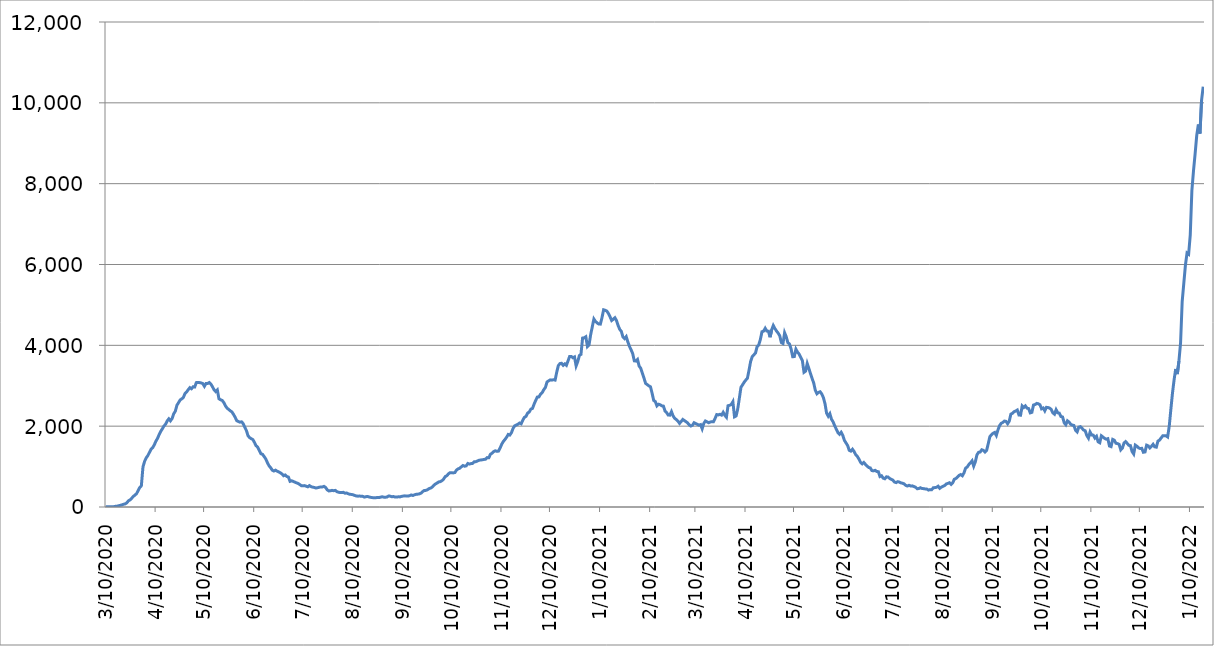
| Category | Series 0 |
|---|---|
| 2020-03-10 | 5 |
| 2020-03-11 | 5 |
| 2020-03-12 | 5 |
| 2020-03-13 | 7 |
| 2020-03-14 | 9 |
| 2020-03-15 | 9 |
| 2020-03-16 | 17 |
| 2020-03-17 | 22 |
| 2020-03-18 | 31 |
| 2020-03-19 | 42 |
| 2020-03-20 | 52 |
| 2020-03-21 | 68 |
| 2020-03-22 | 76 |
| 2020-03-23 | 103 |
| 2020-03-24 | 153 |
| 2020-03-25 | 176 |
| 2020-03-26 | 216 |
| 2020-03-27 | 260 |
| 2020-03-28 | 294 |
| 2020-03-29 | 329 |
| 2020-03-30 | 406 |
| 2020-03-31 | 482 |
| 2020-04-01 | 526 |
| 2020-04-02 | 993 |
| 2020-04-03 | 1129 |
| 2020-04-04 | 1216 |
| 2020-04-05 | 1272 |
| 2020-04-06 | 1351 |
| 2020-04-07 | 1430 |
| 2020-04-08 | 1467 |
| 2020-04-09 | 1538 |
| 2020-04-10 | 1629 |
| 2020-04-11 | 1696 |
| 2020-04-12 | 1792 |
| 2020-04-13 | 1872 |
| 2020-04-14 | 1936 |
| 2020-04-15 | 2006 |
| 2020-04-16 | 2048 |
| 2020-04-17 | 2131 |
| 2020-04-18 | 2182 |
| 2020-04-19 | 2132 |
| 2020-04-20 | 2188 |
| 2020-04-21 | 2305 |
| 2020-04-22 | 2369 |
| 2020-04-23 | 2517 |
| 2020-04-24 | 2582 |
| 2020-04-25 | 2649 |
| 2020-04-26 | 2676 |
| 2020-04-27 | 2713 |
| 2020-04-28 | 2807 |
| 2020-04-29 | 2847 |
| 2020-04-30 | 2903 |
| 2020-05-01 | 2953 |
| 2020-05-02 | 2926 |
| 2020-05-03 | 2974 |
| 2020-05-04 | 2969 |
| 2020-05-05 | 3078 |
| 2020-05-06 | 3083 |
| 2020-05-07 | 3078 |
| 2020-05-08 | 3070 |
| 2020-05-09 | 3054 |
| 2020-05-10 | 2987 |
| 2020-05-11 | 3057 |
| 2020-05-12 | 3056 |
| 2020-05-13 | 3079 |
| 2020-05-14 | 3041 |
| 2020-05-15 | 2975 |
| 2020-05-16 | 2899 |
| 2020-05-17 | 2856 |
| 2020-05-18 | 2896 |
| 2020-05-19 | 2678 |
| 2020-05-20 | 2654 |
| 2020-05-21 | 2637 |
| 2020-05-22 | 2585 |
| 2020-05-23 | 2504 |
| 2020-05-24 | 2448 |
| 2020-05-25 | 2415 |
| 2020-05-26 | 2381 |
| 2020-05-27 | 2354 |
| 2020-05-28 | 2292 |
| 2020-05-29 | 2223 |
| 2020-05-30 | 2137 |
| 2020-05-31 | 2116 |
| 2020-06-01 | 2099 |
| 2020-06-02 | 2107 |
| 2020-06-03 | 2063 |
| 2020-06-04 | 1972 |
| 2020-06-05 | 1891 |
| 2020-06-06 | 1763 |
| 2020-06-07 | 1716 |
| 2020-06-08 | 1689 |
| 2020-06-09 | 1668 |
| 2020-06-10 | 1596 |
| 2020-06-11 | 1515 |
| 2020-06-12 | 1479 |
| 2020-06-13 | 1395 |
| 2020-06-14 | 1317 |
| 2020-06-15 | 1304 |
| 2020-06-16 | 1246 |
| 2020-06-17 | 1186 |
| 2020-06-18 | 1097 |
| 2020-06-19 | 1019 |
| 2020-06-20 | 972 |
| 2020-06-21 | 912 |
| 2020-06-22 | 891 |
| 2020-06-23 | 912 |
| 2020-06-24 | 886 |
| 2020-06-25 | 869 |
| 2020-06-26 | 846 |
| 2020-06-27 | 818 |
| 2020-06-28 | 774 |
| 2020-06-29 | 792 |
| 2020-06-30 | 756 |
| 2020-07-01 | 740 |
| 2020-07-02 | 635 |
| 2020-07-03 | 649 |
| 2020-07-04 | 632 |
| 2020-07-05 | 615 |
| 2020-07-06 | 597 |
| 2020-07-07 | 582 |
| 2020-07-08 | 556 |
| 2020-07-09 | 526 |
| 2020-07-10 | 527 |
| 2020-07-11 | 529 |
| 2020-07-12 | 514 |
| 2020-07-13 | 499 |
| 2020-07-14 | 530 |
| 2020-07-15 | 503 |
| 2020-07-16 | 491 |
| 2020-07-17 | 483 |
| 2020-07-18 | 470 |
| 2020-07-19 | 477 |
| 2020-07-20 | 488 |
| 2020-07-21 | 496 |
| 2020-07-22 | 496 |
| 2020-07-23 | 511 |
| 2020-07-24 | 484 |
| 2020-07-25 | 425 |
| 2020-07-26 | 398 |
| 2020-07-27 | 401 |
| 2020-07-28 | 412 |
| 2020-07-29 | 403 |
| 2020-07-30 | 411 |
| 2020-07-31 | 379 |
| 2020-08-01 | 366 |
| 2020-08-02 | 358 |
| 2020-08-03 | 359 |
| 2020-08-04 | 363 |
| 2020-08-05 | 341 |
| 2020-08-06 | 346 |
| 2020-08-07 | 328 |
| 2020-08-08 | 314 |
| 2020-08-09 | 311 |
| 2020-08-10 | 302 |
| 2020-08-11 | 286 |
| 2020-08-12 | 273 |
| 2020-08-13 | 268 |
| 2020-08-14 | 271 |
| 2020-08-15 | 265 |
| 2020-08-16 | 263 |
| 2020-08-17 | 245 |
| 2020-08-18 | 256 |
| 2020-08-19 | 259 |
| 2020-08-20 | 247 |
| 2020-08-21 | 238 |
| 2020-08-22 | 232 |
| 2020-08-23 | 226 |
| 2020-08-24 | 229 |
| 2020-08-25 | 236 |
| 2020-08-26 | 233 |
| 2020-08-27 | 243 |
| 2020-08-28 | 253 |
| 2020-08-29 | 243 |
| 2020-08-30 | 242 |
| 2020-08-31 | 247 |
| 2020-09-01 | 273 |
| 2020-09-02 | 268 |
| 2020-09-03 | 254 |
| 2020-09-04 | 260 |
| 2020-09-05 | 245 |
| 2020-09-06 | 246 |
| 2020-09-07 | 252 |
| 2020-09-08 | 250 |
| 2020-09-09 | 263 |
| 2020-09-10 | 270 |
| 2020-09-11 | 276 |
| 2020-09-12 | 273 |
| 2020-09-13 | 270 |
| 2020-09-14 | 281 |
| 2020-09-15 | 298 |
| 2020-09-16 | 285 |
| 2020-09-17 | 302 |
| 2020-09-18 | 313 |
| 2020-09-19 | 318 |
| 2020-09-20 | 325 |
| 2020-09-21 | 342 |
| 2020-09-22 | 380 |
| 2020-09-23 | 408 |
| 2020-09-24 | 411 |
| 2020-09-25 | 426 |
| 2020-09-26 | 456 |
| 2020-09-27 | 467 |
| 2020-09-28 | 494 |
| 2020-09-29 | 539 |
| 2020-09-30 | 571 |
| 2020-10-01 | 593 |
| 2020-10-02 | 621 |
| 2020-10-03 | 628 |
| 2020-10-04 | 652 |
| 2020-10-05 | 690 |
| 2020-10-06 | 752 |
| 2020-10-07 | 774 |
| 2020-10-08 | 820 |
| 2020-10-09 | 849 |
| 2020-10-10 | 845 |
| 2020-10-11 | 844 |
| 2020-10-12 | 853 |
| 2020-10-13 | 915 |
| 2020-10-14 | 943 |
| 2020-10-15 | 960 |
| 2020-10-16 | 995 |
| 2020-10-17 | 1026 |
| 2020-10-18 | 1009 |
| 2020-10-19 | 1018 |
| 2020-10-20 | 1077 |
| 2020-10-21 | 1062 |
| 2020-10-22 | 1074 |
| 2020-10-23 | 1079 |
| 2020-10-24 | 1122 |
| 2020-10-25 | 1122 |
| 2020-10-26 | 1140 |
| 2020-10-27 | 1157 |
| 2020-10-28 | 1163 |
| 2020-10-29 | 1168 |
| 2020-10-30 | 1177 |
| 2020-10-31 | 1182 |
| 2020-11-01 | 1222 |
| 2020-11-02 | 1220 |
| 2020-11-03 | 1305 |
| 2020-11-04 | 1333 |
| 2020-11-05 | 1370 |
| 2020-11-06 | 1391 |
| 2020-11-07 | 1377 |
| 2020-11-08 | 1383 |
| 2020-11-09 | 1463 |
| 2020-11-10 | 1556 |
| 2020-11-11 | 1623 |
| 2020-11-12 | 1671 |
| 2020-11-13 | 1727 |
| 2020-11-14 | 1795 |
| 2020-11-15 | 1780 |
| 2020-11-16 | 1840 |
| 2020-11-17 | 1945 |
| 2020-11-18 | 2009 |
| 2020-11-19 | 2027 |
| 2020-11-20 | 2048 |
| 2020-11-21 | 2077 |
| 2020-11-22 | 2059 |
| 2020-11-23 | 2148 |
| 2020-11-24 | 2218 |
| 2020-11-25 | 2243 |
| 2020-11-26 | 2324 |
| 2020-11-27 | 2350 |
| 2020-11-28 | 2422 |
| 2020-11-29 | 2438 |
| 2020-11-30 | 2545 |
| 2020-12-01 | 2638 |
| 2020-12-02 | 2720 |
| 2020-12-03 | 2724 |
| 2020-12-04 | 2793 |
| 2020-12-05 | 2830 |
| 2020-12-06 | 2903 |
| 2020-12-07 | 2957 |
| 2020-12-08 | 3093 |
| 2020-12-09 | 3121 |
| 2020-12-10 | 3145 |
| 2020-12-11 | 3139 |
| 2020-12-12 | 3149 |
| 2020-12-13 | 3140 |
| 2020-12-14 | 3335 |
| 2020-12-15 | 3499 |
| 2020-12-16 | 3549 |
| 2020-12-17 | 3556 |
| 2020-12-18 | 3506 |
| 2020-12-19 | 3542 |
| 2020-12-20 | 3506 |
| 2020-12-21 | 3616 |
| 2020-12-22 | 3726 |
| 2020-12-23 | 3725 |
| 2020-12-24 | 3694 |
| 2020-12-25 | 3714 |
| 2020-12-26 | 3491 |
| 2020-12-27 | 3596 |
| 2020-12-28 | 3747 |
| 2020-12-29 | 3776 |
| 2020-12-30 | 4180 |
| 2020-12-31 | 4187 |
| 2021-01-01 | 4212 |
| 2021-01-02 | 3970 |
| 2021-01-03 | 4012 |
| 2021-01-04 | 4263 |
| 2021-01-05 | 4457 |
| 2021-01-06 | 4651 |
| 2021-01-07 | 4592 |
| 2021-01-08 | 4554 |
| 2021-01-09 | 4527 |
| 2021-01-10 | 4525 |
| 2021-01-11 | 4683 |
| 2021-01-12 | 4879 |
| 2021-01-13 | 4868 |
| 2021-01-14 | 4848 |
| 2021-01-15 | 4787 |
| 2021-01-16 | 4706 |
| 2021-01-17 | 4614 |
| 2021-01-18 | 4645 |
| 2021-01-19 | 4683 |
| 2021-01-20 | 4612 |
| 2021-01-21 | 4490 |
| 2021-01-22 | 4395 |
| 2021-01-23 | 4344 |
| 2021-01-24 | 4204 |
| 2021-01-25 | 4165 |
| 2021-01-26 | 4215 |
| 2021-01-27 | 4087 |
| 2021-01-28 | 3975 |
| 2021-01-29 | 3890 |
| 2021-01-30 | 3797 |
| 2021-01-31 | 3617 |
| 2021-02-01 | 3610 |
| 2021-02-02 | 3649 |
| 2021-02-03 | 3486 |
| 2021-02-04 | 3432 |
| 2021-02-05 | 3312 |
| 2021-02-06 | 3188 |
| 2021-02-07 | 3058 |
| 2021-02-08 | 3029 |
| 2021-02-09 | 2997 |
| 2021-02-10 | 2975 |
| 2021-02-11 | 2816 |
| 2021-02-12 | 2638 |
| 2021-02-13 | 2608 |
| 2021-02-14 | 2503 |
| 2021-02-15 | 2542 |
| 2021-02-16 | 2531 |
| 2021-02-17 | 2504 |
| 2021-02-18 | 2497 |
| 2021-02-19 | 2375 |
| 2021-02-20 | 2335 |
| 2021-02-21 | 2274 |
| 2021-02-22 | 2273 |
| 2021-02-23 | 2360 |
| 2021-02-24 | 2255 |
| 2021-02-25 | 2193 |
| 2021-02-26 | 2163 |
| 2021-02-27 | 2126 |
| 2021-02-28 | 2069 |
| 2021-03-01 | 2114 |
| 2021-03-02 | 2166 |
| 2021-03-03 | 2138 |
| 2021-03-04 | 2111 |
| 2021-03-05 | 2080 |
| 2021-03-06 | 2031 |
| 2021-03-07 | 2003 |
| 2021-03-08 | 2022 |
| 2021-03-09 | 2086 |
| 2021-03-10 | 2066 |
| 2021-03-11 | 2046 |
| 2021-03-12 | 2026 |
| 2021-03-13 | 2039 |
| 2021-03-14 | 1935 |
| 2021-03-15 | 2069 |
| 2021-03-16 | 2128 |
| 2021-03-17 | 2108 |
| 2021-03-18 | 2085 |
| 2021-03-19 | 2102 |
| 2021-03-20 | 2112 |
| 2021-03-21 | 2112 |
| 2021-03-22 | 2193 |
| 2021-03-23 | 2287 |
| 2021-03-24 | 2278 |
| 2021-03-25 | 2293 |
| 2021-03-26 | 2273 |
| 2021-03-27 | 2343 |
| 2021-03-28 | 2269 |
| 2021-03-29 | 2221 |
| 2021-03-30 | 2506 |
| 2021-03-31 | 2516 |
| 2021-04-01 | 2537 |
| 2021-04-02 | 2605 |
| 2021-04-03 | 2231 |
| 2021-04-04 | 2253 |
| 2021-04-05 | 2426 |
| 2021-04-06 | 2692 |
| 2021-04-07 | 2963 |
| 2021-04-08 | 3024 |
| 2021-04-09 | 3088 |
| 2021-04-10 | 3141 |
| 2021-04-11 | 3187 |
| 2021-04-12 | 3388 |
| 2021-04-13 | 3605 |
| 2021-04-14 | 3721 |
| 2021-04-15 | 3766 |
| 2021-04-16 | 3811 |
| 2021-04-17 | 3970 |
| 2021-04-18 | 4010 |
| 2021-04-19 | 4145 |
| 2021-04-20 | 4337 |
| 2021-04-21 | 4351 |
| 2021-04-22 | 4422 |
| 2021-04-23 | 4354 |
| 2021-04-24 | 4350 |
| 2021-04-25 | 4200 |
| 2021-04-26 | 4384 |
| 2021-04-27 | 4491 |
| 2021-04-28 | 4416 |
| 2021-04-29 | 4354 |
| 2021-04-30 | 4303 |
| 2021-05-01 | 4236 |
| 2021-05-02 | 4068 |
| 2021-05-03 | 4045 |
| 2021-05-04 | 4311 |
| 2021-05-05 | 4213 |
| 2021-05-06 | 4066 |
| 2021-05-07 | 4035 |
| 2021-05-08 | 3913 |
| 2021-05-09 | 3720 |
| 2021-05-10 | 3721 |
| 2021-05-11 | 3905 |
| 2021-05-12 | 3832 |
| 2021-05-13 | 3783 |
| 2021-05-14 | 3700 |
| 2021-05-15 | 3621 |
| 2021-05-16 | 3333 |
| 2021-05-17 | 3362 |
| 2021-05-18 | 3552 |
| 2021-05-19 | 3432 |
| 2021-05-20 | 3301 |
| 2021-05-21 | 3182 |
| 2021-05-22 | 3070 |
| 2021-05-23 | 2888 |
| 2021-05-24 | 2802 |
| 2021-05-25 | 2837 |
| 2021-05-26 | 2851 |
| 2021-05-27 | 2796 |
| 2021-05-28 | 2707 |
| 2021-05-29 | 2556 |
| 2021-05-30 | 2320 |
| 2021-05-31 | 2246 |
| 2021-06-01 | 2308 |
| 2021-06-02 | 2172 |
| 2021-06-03 | 2107 |
| 2021-06-04 | 2010 |
| 2021-06-05 | 1924 |
| 2021-06-06 | 1840 |
| 2021-06-07 | 1800 |
| 2021-06-08 | 1849 |
| 2021-06-09 | 1774 |
| 2021-06-10 | 1648 |
| 2021-06-11 | 1585 |
| 2021-06-12 | 1521 |
| 2021-06-13 | 1402 |
| 2021-06-14 | 1383 |
| 2021-06-15 | 1429 |
| 2021-06-16 | 1373 |
| 2021-06-17 | 1295 |
| 2021-06-18 | 1251 |
| 2021-06-19 | 1185 |
| 2021-06-20 | 1104 |
| 2021-06-21 | 1068 |
| 2021-06-22 | 1102 |
| 2021-06-23 | 1056 |
| 2021-06-24 | 1016 |
| 2021-06-25 | 978 |
| 2021-06-26 | 967 |
| 2021-06-27 | 901 |
| 2021-06-28 | 894 |
| 2021-06-29 | 908 |
| 2021-06-30 | 880 |
| 2021-07-01 | 873 |
| 2021-07-02 | 754 |
| 2021-07-03 | 773 |
| 2021-07-04 | 714 |
| 2021-07-05 | 699 |
| 2021-07-06 | 746 |
| 2021-07-07 | 744 |
| 2021-07-08 | 705 |
| 2021-07-09 | 686 |
| 2021-07-10 | 664 |
| 2021-07-11 | 617 |
| 2021-07-12 | 604 |
| 2021-07-13 | 627 |
| 2021-07-14 | 617 |
| 2021-07-15 | 597 |
| 2021-07-16 | 588 |
| 2021-07-17 | 571 |
| 2021-07-18 | 534 |
| 2021-07-19 | 519 |
| 2021-07-20 | 537 |
| 2021-07-21 | 520 |
| 2021-07-22 | 523 |
| 2021-07-23 | 506 |
| 2021-07-24 | 491 |
| 2021-07-25 | 452 |
| 2021-07-26 | 456 |
| 2021-07-27 | 476 |
| 2021-07-28 | 458 |
| 2021-07-29 | 454 |
| 2021-07-30 | 447 |
| 2021-07-31 | 444 |
| 2021-08-01 | 419 |
| 2021-08-02 | 430 |
| 2021-08-03 | 428 |
| 2021-08-04 | 475 |
| 2021-08-05 | 480 |
| 2021-08-06 | 488 |
| 2021-08-07 | 515 |
| 2021-08-08 | 462 |
| 2021-08-09 | 493 |
| 2021-08-10 | 512 |
| 2021-08-11 | 530 |
| 2021-08-12 | 571 |
| 2021-08-13 | 583 |
| 2021-08-14 | 600 |
| 2021-08-15 | 559 |
| 2021-08-16 | 597 |
| 2021-08-17 | 687 |
| 2021-08-18 | 706 |
| 2021-08-19 | 743 |
| 2021-08-20 | 782 |
| 2021-08-21 | 802 |
| 2021-08-22 | 773 |
| 2021-08-23 | 845 |
| 2021-08-24 | 960 |
| 2021-08-25 | 991 |
| 2021-08-26 | 1051 |
| 2021-08-27 | 1092 |
| 2021-08-28 | 1142 |
| 2021-08-29 | 1011 |
| 2021-08-30 | 1116 |
| 2021-08-31 | 1290 |
| 2021-09-01 | 1352 |
| 2021-09-02 | 1360 |
| 2021-09-03 | 1416 |
| 2021-09-04 | 1402 |
| 2021-09-05 | 1359 |
| 2021-09-06 | 1401 |
| 2021-09-07 | 1567 |
| 2021-09-08 | 1739 |
| 2021-09-09 | 1789 |
| 2021-09-10 | 1824 |
| 2021-09-11 | 1845 |
| 2021-09-12 | 1771 |
| 2021-09-13 | 1907 |
| 2021-09-14 | 2012 |
| 2021-09-15 | 2071 |
| 2021-09-16 | 2091 |
| 2021-09-17 | 2126 |
| 2021-09-18 | 2119 |
| 2021-09-19 | 2061 |
| 2021-09-20 | 2125 |
| 2021-09-21 | 2298 |
| 2021-09-22 | 2318 |
| 2021-09-23 | 2358 |
| 2021-09-24 | 2375 |
| 2021-09-25 | 2399 |
| 2021-09-26 | 2275 |
| 2021-09-27 | 2272 |
| 2021-09-28 | 2502 |
| 2021-09-29 | 2462 |
| 2021-09-30 | 2501 |
| 2021-10-01 | 2446 |
| 2021-10-02 | 2435 |
| 2021-10-03 | 2329 |
| 2021-10-04 | 2343 |
| 2021-10-05 | 2522 |
| 2021-10-06 | 2535 |
| 2021-10-07 | 2563 |
| 2021-10-08 | 2554 |
| 2021-10-09 | 2530 |
| 2021-10-10 | 2429 |
| 2021-10-11 | 2450 |
| 2021-10-12 | 2379 |
| 2021-10-13 | 2466 |
| 2021-10-14 | 2460 |
| 2021-10-15 | 2447 |
| 2021-10-16 | 2412 |
| 2021-10-17 | 2328 |
| 2021-10-18 | 2296 |
| 2021-10-19 | 2407 |
| 2021-10-20 | 2329 |
| 2021-10-21 | 2321 |
| 2021-10-22 | 2239 |
| 2021-10-23 | 2227 |
| 2021-10-24 | 2084 |
| 2021-10-25 | 2036 |
| 2021-10-26 | 2133 |
| 2021-10-27 | 2102 |
| 2021-10-28 | 2048 |
| 2021-10-29 | 2027 |
| 2021-10-30 | 2017 |
| 2021-10-31 | 1900 |
| 2021-11-01 | 1858 |
| 2021-11-02 | 1975 |
| 2021-11-03 | 1987 |
| 2021-11-04 | 1947 |
| 2021-11-05 | 1905 |
| 2021-11-06 | 1885 |
| 2021-11-07 | 1768 |
| 2021-11-08 | 1704 |
| 2021-11-09 | 1855 |
| 2021-11-10 | 1783 |
| 2021-11-11 | 1778 |
| 2021-11-12 | 1705 |
| 2021-11-13 | 1749 |
| 2021-11-14 | 1613 |
| 2021-11-15 | 1590 |
| 2021-11-16 | 1762 |
| 2021-11-17 | 1731 |
| 2021-11-18 | 1699 |
| 2021-11-19 | 1678 |
| 2021-11-20 | 1690 |
| 2021-11-21 | 1509 |
| 2021-11-22 | 1494 |
| 2021-11-23 | 1672 |
| 2021-11-24 | 1653 |
| 2021-11-25 | 1577 |
| 2021-11-26 | 1568 |
| 2021-11-27 | 1549 |
| 2021-11-28 | 1414 |
| 2021-11-29 | 1456 |
| 2021-11-30 | 1582 |
| 2021-12-01 | 1618 |
| 2021-12-02 | 1574 |
| 2021-12-03 | 1526 |
| 2021-12-04 | 1518 |
| 2021-12-05 | 1373 |
| 2021-12-06 | 1312 |
| 2021-12-07 | 1531 |
| 2021-12-08 | 1503 |
| 2021-12-09 | 1464 |
| 2021-12-10 | 1446 |
| 2021-12-11 | 1452 |
| 2021-12-12 | 1354 |
| 2021-12-13 | 1362 |
| 2021-12-14 | 1530 |
| 2021-12-15 | 1513 |
| 2021-12-16 | 1461 |
| 2021-12-17 | 1503 |
| 2021-12-18 | 1551 |
| 2021-12-19 | 1488 |
| 2021-12-20 | 1480 |
| 2021-12-21 | 1630 |
| 2021-12-22 | 1656 |
| 2021-12-23 | 1710 |
| 2021-12-24 | 1761 |
| 2021-12-25 | 1761 |
| 2021-12-26 | 1761 |
| 2021-12-27 | 1733 |
| 2021-12-28 | 1999 |
| 2021-12-29 | 2418 |
| 2021-12-30 | 2820 |
| 2021-12-31 | 3148 |
| 2022-01-01 | 3416 |
| 2022-01-02 | 3289 |
| 2022-01-03 | 3614 |
| 2022-01-04 | 4059 |
| 2022-01-05 | 5083 |
| 2022-01-06 | 5532 |
| 2022-01-07 | 5981 |
| 2022-01-08 | 6286 |
| 2022-01-09 | 6255 |
| 2022-01-10 | 6733 |
| 2022-01-11 | 7829 |
| 2022-01-12 | 8314 |
| 2022-01-13 | 8737 |
| 2022-01-14 | 9191 |
| 2022-01-15 | 9463 |
| 2022-01-16 | 9240 |
| 2022-01-17 | 10070 |
| 2022-01-18 | 10402 |